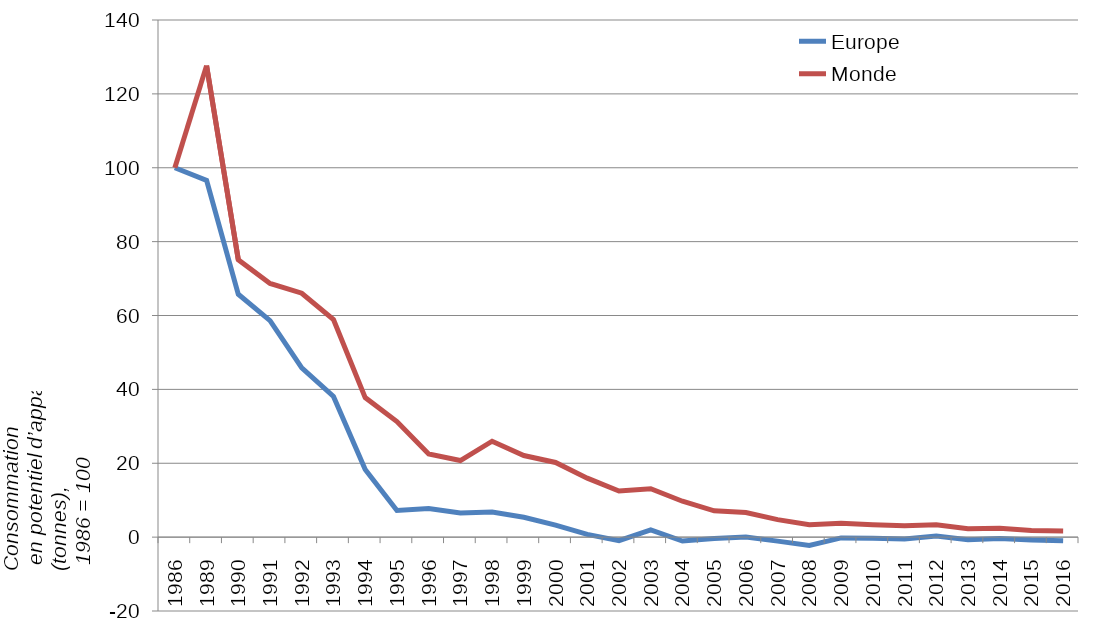
| Category | Europe | Monde |
|---|---|---|
| 1986.0 | 100 | 100 |
| 1989.0 | 96.57 | 127.65 |
| 1990.0 | 65.74 | 75.09 |
| 1991.0 | 58.61 | 68.67 |
| 1992.0 | 45.82 | 66.03 |
| 1993.0 | 38.08 | 58.9 |
| 1994.0 | 18.31 | 37.77 |
| 1995.0 | 7.23 | 31.27 |
| 1996.0 | 7.76 | 22.5 |
| 1997.0 | 6.52 | 20.73 |
| 1998.0 | 6.82 | 25.97 |
| 1999.0 | 5.38 | 22.1 |
| 2000.0 | 3.27 | 20.21 |
| 2001.0 | 0.74 | 15.97 |
| 2002.0 | -0.96 | 12.5 |
| 2003.0 | 1.97 | 13.1 |
| 2004.0 | -1.05 | 9.71 |
| 2005.0 | -0.4 | 7.12 |
| 2006.0 | 0.01 | 6.64 |
| 2007.0 | -1.08 | 4.73 |
| 2008.0 | -2.24 | 3.36 |
| 2009.0 | -0.21 | 3.78 |
| 2010.0 | -0.3 | 3.36 |
| 2011.0 | -0.48 | 3.08 |
| 2012.0 | 0.29 | 3.37 |
| 2013.0 | -0.73 | 2.24 |
| 2014.0 | -0.34 | 2.37 |
| 2015.0 | -0.77 | 1.77 |
| 2016.0 | -0.97 | 1.64 |